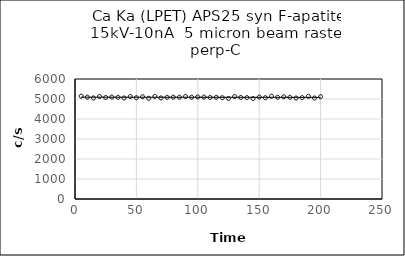
| Category | Series 0 |
|---|---|
| 5.0 | 5141.6 |
| 10.0 | 5092.2 |
| 15.0 | 5051.8 |
| 20.0 | 5124 |
| 25.0 | 5077.2 |
| 30.0 | 5094.8 |
| 35.0 | 5084.6 |
| 40.0 | 5049.6 |
| 45.0 | 5124.2 |
| 50.0 | 5063.8 |
| 55.0 | 5113.6 |
| 60.0 | 5035.4 |
| 65.0 | 5129.4 |
| 70.0 | 5051.8 |
| 75.0 | 5085.8 |
| 80.0 | 5091.2 |
| 85.0 | 5090 |
| 90.0 | 5126.8 |
| 95.0 | 5090.2 |
| 100.0 | 5102 |
| 105.0 | 5095 |
| 110.0 | 5076.2 |
| 115.0 | 5084 |
| 120.0 | 5065.2 |
| 125.0 | 5030.2 |
| 130.0 | 5121.8 |
| 135.0 | 5078.2 |
| 140.0 | 5068.6 |
| 145.0 | 5023.4 |
| 150.0 | 5097.8 |
| 155.0 | 5064.2 |
| 160.0 | 5139 |
| 165.0 | 5086.6 |
| 170.0 | 5108.6 |
| 175.0 | 5085.2 |
| 180.0 | 5048.2 |
| 185.0 | 5068 |
| 190.0 | 5134.2 |
| 195.0 | 5049 |
| 200.0 | 5114.2 |